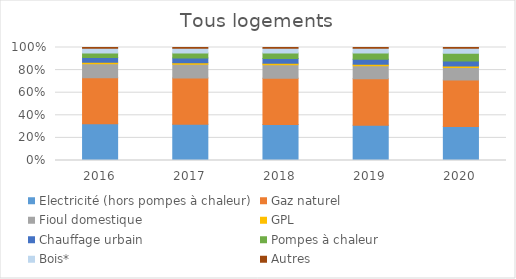
| Category | Electricité (hors pompes à chaleur) | Gaz naturel | Fioul domestique | GPL | Chauffage urbain | Pompes à chaleur | Bois* | Autres |
|---|---|---|---|---|---|---|---|---|
| 2016.0 | 0.324 | 0.408 | 0.124 | 0.014 | 0.041 | 0.039 | 0.043 | 0.006 |
| 2017.0 | 0.321 | 0.409 | 0.121 | 0.014 | 0.042 | 0.043 | 0.043 | 0.006 |
| 2018.0 | 0.318 | 0.41 | 0.119 | 0.014 | 0.043 | 0.047 | 0.043 | 0.006 |
| 2019.0 | 0.313 | 0.412 | 0.115 | 0.013 | 0.043 | 0.055 | 0.043 | 0.006 |
| 2020.0 | 0.3 | 0.413 | 0.109 | 0.013 | 0.044 | 0.07 | 0.044 | 0.006 |